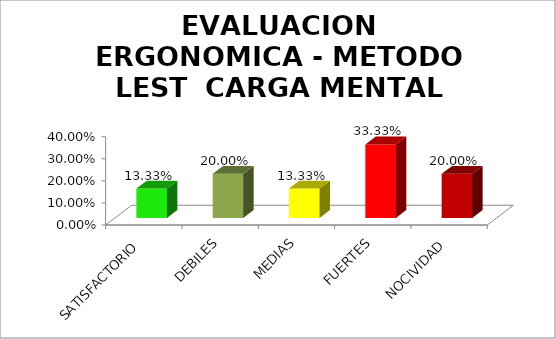
| Category | EVALUACION ERGONOMICA - METODO LEST  |
|---|---|
| SATISFACTORIO | 0.133 |
| DEBILES | 0.2 |
| MEDIAS | 0.133 |
| FUERTES | 0.333 |
| NOCIVIDAD | 0.2 |